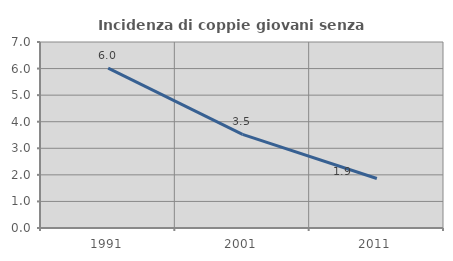
| Category | Incidenza di coppie giovani senza figli |
|---|---|
| 1991.0 | 6.015 |
| 2001.0 | 3.521 |
| 2011.0 | 1.863 |